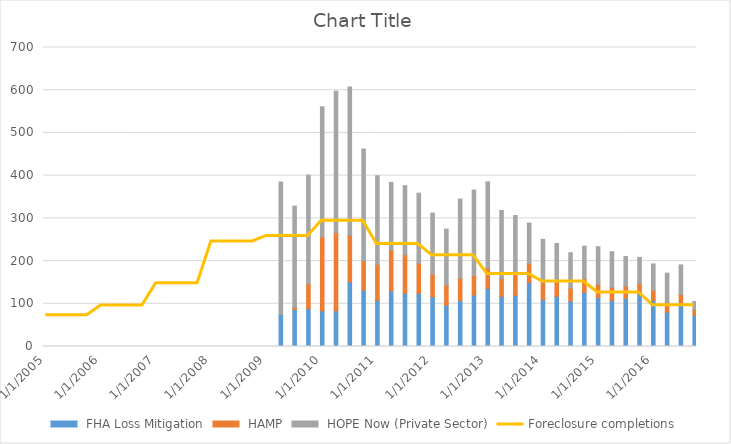
| Category | Series 0 | Series 1 | Series 2 |
|---|---|---|---|
| 1/1/05 | 0 | 0 | 0 |
| 4/1/05 | 0 | 0 | 0 |
| 7/1/05 | 0 | 0 | 0 |
| 10/1/05 | 0 | 0 | 0 |
| 1/1/06 | 0 | 0 | 0 |
| 4/1/06 | 0 | 0 | 0 |
| 7/1/06 | 0 | 0 | 0 |
| 10/1/06 | 0 | 0 | 0 |
| 1/1/07 | 0 | 0 | 0 |
| 4/1/07 | 0 | 0 | 0 |
| 7/1/07 | 0 | 0 | 0 |
| 10/1/07 | 0 | 0 | 0 |
| 1/1/08 | 0 | 0 | 0 |
| 4/1/08 | 0 | 0 | 0 |
| 7/1/08 | 0 | 0 | 0 |
| 10/1/08 | 0 | 0 | 0 |
| 1/1/09 | 0 | 0 | 0 |
| 4/1/09 | 74.77 | 0 | 310.555 |
| 7/1/09 | 86.619 | 5.304 | 236.734 |
| 10/1/09 | 88.234 | 58.234 | 254.764 |
| 1/1/10 | 83.552 | 172.266 | 305.518 |
| 4/1/10 | 83.268 | 183.035 | 331.22 |
| 7/1/10 | 151.693 | 109.038 | 346.911 |
| 10/1/10 | 132.473 | 68.538 | 261.446 |
| 1/1/11 | 107.763 | 84.099 | 207.913 |
| 4/1/11 | 130.393 | 95.302 | 158.539 |
| 7/1/11 | 125.058 | 89.752 | 161.763 |
| 10/1/11 | 124.54 | 70.235 | 164.17 |
| 1/1/12 | 116.28 | 52.728 | 143.269 |
| 4/1/12 | 96.644 | 46.754 | 131.556 |
| 7/1/12 | 107.685 | 52.048 | 185.607 |
| 10/1/12 | 120.455 | 45.595 | 200.21 |
| 1/1/13 | 136.139 | 47.102 | 202.156 |
| 4/1/13 | 117.489 | 41.311 | 159.625 |
| 7/1/13 | 119.502 | 50.96 | 136.107 |
| 10/1/13 | 150.003 | 44.537 | 94.495 |
| 1/1/14 | 109.798 | 40.159 | 101.037 |
| 4/1/14 | 117.638 | 32.985 | 90.654 |
| 7/1/14 | 106.35 | 29.498 | 83.719 |
| 10/1/14 | 126.294 | 31.764 | 76.724 |
| 1/1/15 | 114.54 | 31.407 | 87.723 |
| 4/1/15 | 107.69 | 30.464 | 83.921 |
| 7/1/15 | 112.63 | 29.089 | 69.025 |
| 10/1/15 | 123.17 | 24.3 | 61.118 |
| 1/1/16 | 107.53 | 24.005 | 61.838 |
| 4/1/16 | 80.23 | 23.015 | 68.514 |
| 7/1/16 | 98.86 | 22.841 | 69.322 |
| 10/1/16 | 72.88 | 13.719 | 18.937 |